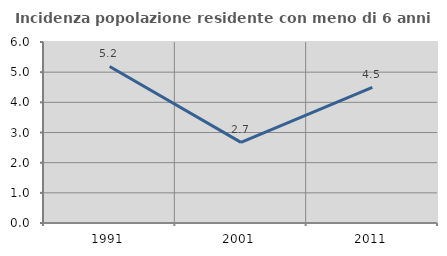
| Category | Incidenza popolazione residente con meno di 6 anni |
|---|---|
| 1991.0 | 5.19 |
| 2001.0 | 2.672 |
| 2011.0 | 4.494 |